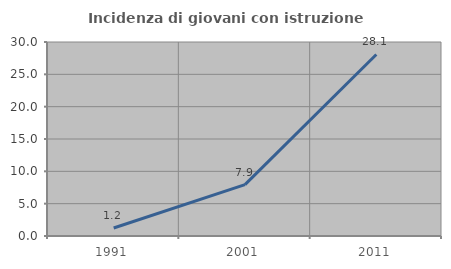
| Category | Incidenza di giovani con istruzione universitaria |
|---|---|
| 1991.0 | 1.235 |
| 2001.0 | 7.937 |
| 2011.0 | 28.07 |